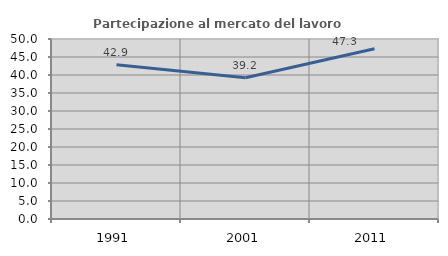
| Category | Partecipazione al mercato del lavoro  femminile |
|---|---|
| 1991.0 | 42.857 |
| 2001.0 | 39.221 |
| 2011.0 | 47.268 |